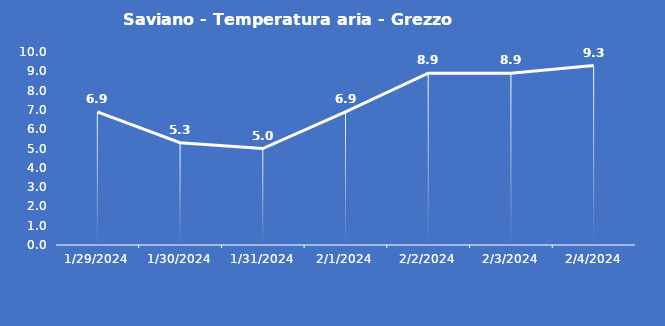
| Category | Saviano - Temperatura aria - Grezzo (°C) |
|---|---|
| 1/29/24 | 6.9 |
| 1/30/24 | 5.3 |
| 1/31/24 | 5 |
| 2/1/24 | 6.9 |
| 2/2/24 | 8.9 |
| 2/3/24 | 8.9 |
| 2/4/24 | 9.3 |